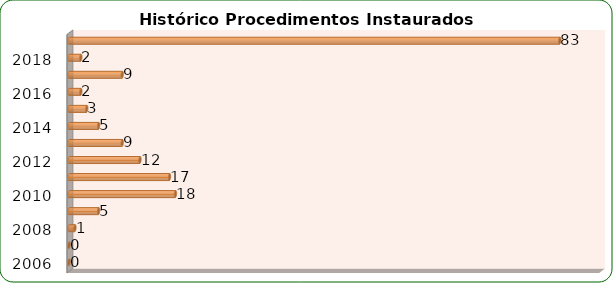
| Category | Total de Sindicâncias  |
|---|---|
| 2006 | 0 |
| 2007 | 0 |
| 2008 | 1 |
| 2009 | 5 |
| 2010 | 18 |
| 2011 | 17 |
| 2012 | 12 |
| 2013 | 9 |
| 2014 | 5 |
| 2015 | 3 |
| 2016 | 2 |
| 2017 | 9 |
| 2018 | 2 |
| Total | 83 |